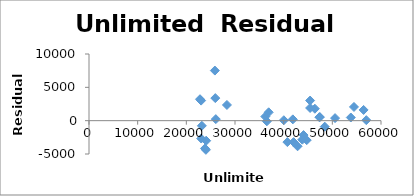
| Category | Series 0 |
|---|---|
| 23829.5 | -4167.048 |
| 24021.0 | -4374.234 |
| 23062.7 | -2679.175 |
| 24080.1 | -3003.884 |
| 23187.1 | -771.306 |
| 25953.7 | 3384.062 |
| 25862.2 | 7514.465 |
| 23036.3 | 3009.569 |
| 22811.2 | 3216.001 |
| 26056.4 | 229.225 |
| 28346.1 | 2354.949 |
| 36230.9 | 619.072 |
| 36544.5 | -95.047 |
| 36925.0 | 1254.936 |
| 41888.3 | 194.974 |
| 47438.5 | 537.352 |
| 40031.4 | 63.12 |
| 43829.6 | -2851.778 |
| 44737.6 | -2918.85 |
| 42858.2 | -3842.813 |
| 42042.0 | -3220.046 |
| 40760.3 | -3213.289 |
| 44082.0 | -2161.585 |
| 47342.0 | 511.381 |
| 45430.8 | 3016.719 |
| 45435.9 | 1902.559 |
| 46410.0 | 1794.254 |
| 53795.2 | 473.343 |
| 54445.1 | 2058.031 |
| 56976.5 | 75.332 |
| 48440.7 | -902.205 |
| 56423.7 | 1608.399 |
| 50562.6 | 383.516 |